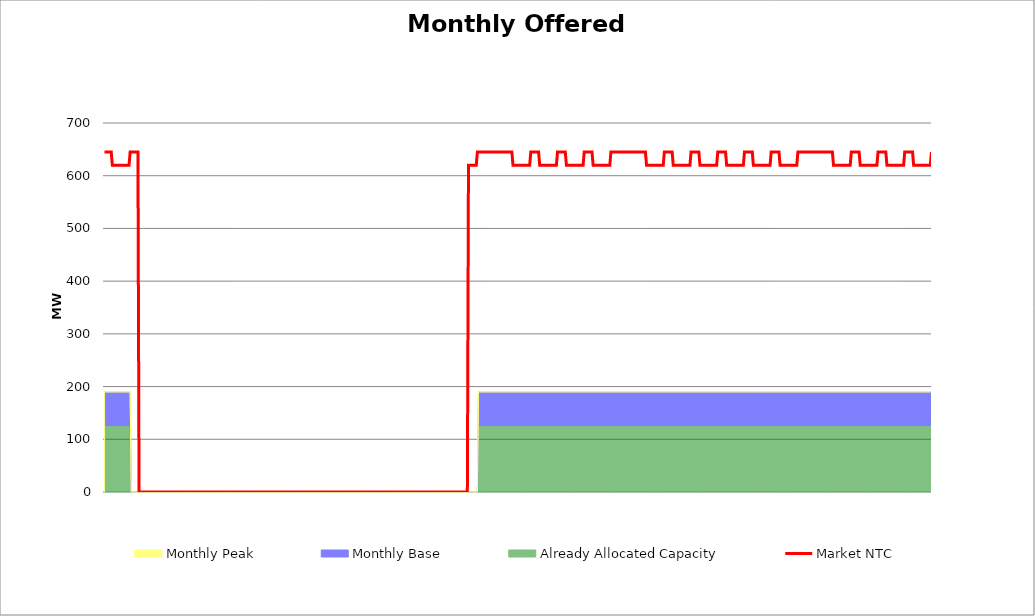
| Category | Market NTC |
|---|---|
| 0 | 645 |
| 1 | 645 |
| 2 | 645 |
| 3 | 645 |
| 4 | 645 |
| 5 | 645 |
| 6 | 645 |
| 7 | 620 |
| 8 | 620 |
| 9 | 620 |
| 10 | 620 |
| 11 | 620 |
| 12 | 620 |
| 13 | 620 |
| 14 | 620 |
| 15 | 620 |
| 16 | 620 |
| 17 | 620 |
| 18 | 620 |
| 19 | 620 |
| 20 | 620 |
| 21 | 620 |
| 22 | 620 |
| 23 | 645 |
| 24 | 645 |
| 25 | 645 |
| 26 | 645 |
| 27 | 645 |
| 28 | 645 |
| 29 | 645 |
| 30 | 645 |
| 31 | 0 |
| 32 | 0 |
| 33 | 0 |
| 34 | 0 |
| 35 | 0 |
| 36 | 0 |
| 37 | 0 |
| 38 | 0 |
| 39 | 0 |
| 40 | 0 |
| 41 | 0 |
| 42 | 0 |
| 43 | 0 |
| 44 | 0 |
| 45 | 0 |
| 46 | 0 |
| 47 | 0 |
| 48 | 0 |
| 49 | 0 |
| 50 | 0 |
| 51 | 0 |
| 52 | 0 |
| 53 | 0 |
| 54 | 0 |
| 55 | 0 |
| 56 | 0 |
| 57 | 0 |
| 58 | 0 |
| 59 | 0 |
| 60 | 0 |
| 61 | 0 |
| 62 | 0 |
| 63 | 0 |
| 64 | 0 |
| 65 | 0 |
| 66 | 0 |
| 67 | 0 |
| 68 | 0 |
| 69 | 0 |
| 70 | 0 |
| 71 | 0 |
| 72 | 0 |
| 73 | 0 |
| 74 | 0 |
| 75 | 0 |
| 76 | 0 |
| 77 | 0 |
| 78 | 0 |
| 79 | 0 |
| 80 | 0 |
| 81 | 0 |
| 82 | 0 |
| 83 | 0 |
| 84 | 0 |
| 85 | 0 |
| 86 | 0 |
| 87 | 0 |
| 88 | 0 |
| 89 | 0 |
| 90 | 0 |
| 91 | 0 |
| 92 | 0 |
| 93 | 0 |
| 94 | 0 |
| 95 | 0 |
| 96 | 0 |
| 97 | 0 |
| 98 | 0 |
| 99 | 0 |
| 100 | 0 |
| 101 | 0 |
| 102 | 0 |
| 103 | 0 |
| 104 | 0 |
| 105 | 0 |
| 106 | 0 |
| 107 | 0 |
| 108 | 0 |
| 109 | 0 |
| 110 | 0 |
| 111 | 0 |
| 112 | 0 |
| 113 | 0 |
| 114 | 0 |
| 115 | 0 |
| 116 | 0 |
| 117 | 0 |
| 118 | 0 |
| 119 | 0 |
| 120 | 0 |
| 121 | 0 |
| 122 | 0 |
| 123 | 0 |
| 124 | 0 |
| 125 | 0 |
| 126 | 0 |
| 127 | 0 |
| 128 | 0 |
| 129 | 0 |
| 130 | 0 |
| 131 | 0 |
| 132 | 0 |
| 133 | 0 |
| 134 | 0 |
| 135 | 0 |
| 136 | 0 |
| 137 | 0 |
| 138 | 0 |
| 139 | 0 |
| 140 | 0 |
| 141 | 0 |
| 142 | 0 |
| 143 | 0 |
| 144 | 0 |
| 145 | 0 |
| 146 | 0 |
| 147 | 0 |
| 148 | 0 |
| 149 | 0 |
| 150 | 0 |
| 151 | 0 |
| 152 | 0 |
| 153 | 0 |
| 154 | 0 |
| 155 | 0 |
| 156 | 0 |
| 157 | 0 |
| 158 | 0 |
| 159 | 0 |
| 160 | 0 |
| 161 | 0 |
| 162 | 0 |
| 163 | 0 |
| 164 | 0 |
| 165 | 0 |
| 166 | 0 |
| 167 | 0 |
| 168 | 0 |
| 169 | 0 |
| 170 | 0 |
| 171 | 0 |
| 172 | 0 |
| 173 | 0 |
| 174 | 0 |
| 175 | 0 |
| 176 | 0 |
| 177 | 0 |
| 178 | 0 |
| 179 | 0 |
| 180 | 0 |
| 181 | 0 |
| 182 | 0 |
| 183 | 0 |
| 184 | 0 |
| 185 | 0 |
| 186 | 0 |
| 187 | 0 |
| 188 | 0 |
| 189 | 0 |
| 190 | 0 |
| 191 | 0 |
| 192 | 0 |
| 193 | 0 |
| 194 | 0 |
| 195 | 0 |
| 196 | 0 |
| 197 | 0 |
| 198 | 0 |
| 199 | 0 |
| 200 | 0 |
| 201 | 0 |
| 202 | 0 |
| 203 | 0 |
| 204 | 0 |
| 205 | 0 |
| 206 | 0 |
| 207 | 0 |
| 208 | 0 |
| 209 | 0 |
| 210 | 0 |
| 211 | 0 |
| 212 | 0 |
| 213 | 0 |
| 214 | 0 |
| 215 | 0 |
| 216 | 0 |
| 217 | 0 |
| 218 | 0 |
| 219 | 0 |
| 220 | 0 |
| 221 | 0 |
| 222 | 0 |
| 223 | 0 |
| 224 | 0 |
| 225 | 0 |
| 226 | 0 |
| 227 | 0 |
| 228 | 0 |
| 229 | 0 |
| 230 | 0 |
| 231 | 0 |
| 232 | 0 |
| 233 | 0 |
| 234 | 0 |
| 235 | 0 |
| 236 | 0 |
| 237 | 0 |
| 238 | 0 |
| 239 | 0 |
| 240 | 0 |
| 241 | 0 |
| 242 | 0 |
| 243 | 0 |
| 244 | 0 |
| 245 | 0 |
| 246 | 0 |
| 247 | 0 |
| 248 | 0 |
| 249 | 0 |
| 250 | 0 |
| 251 | 0 |
| 252 | 0 |
| 253 | 0 |
| 254 | 0 |
| 255 | 0 |
| 256 | 0 |
| 257 | 0 |
| 258 | 0 |
| 259 | 0 |
| 260 | 0 |
| 261 | 0 |
| 262 | 0 |
| 263 | 0 |
| 264 | 0 |
| 265 | 0 |
| 266 | 0 |
| 267 | 0 |
| 268 | 0 |
| 269 | 0 |
| 270 | 0 |
| 271 | 0 |
| 272 | 0 |
| 273 | 0 |
| 274 | 0 |
| 275 | 0 |
| 276 | 0 |
| 277 | 0 |
| 278 | 0 |
| 279 | 0 |
| 280 | 0 |
| 281 | 0 |
| 282 | 0 |
| 283 | 0 |
| 284 | 0 |
| 285 | 0 |
| 286 | 0 |
| 287 | 0 |
| 288 | 0 |
| 289 | 0 |
| 290 | 0 |
| 291 | 0 |
| 292 | 0 |
| 293 | 0 |
| 294 | 0 |
| 295 | 0 |
| 296 | 0 |
| 297 | 0 |
| 298 | 0 |
| 299 | 0 |
| 300 | 0 |
| 301 | 0 |
| 302 | 0 |
| 303 | 0 |
| 304 | 0 |
| 305 | 0 |
| 306 | 0 |
| 307 | 0 |
| 308 | 0 |
| 309 | 0 |
| 310 | 0 |
| 311 | 0 |
| 312 | 0 |
| 313 | 0 |
| 314 | 0 |
| 315 | 0 |
| 316 | 0 |
| 317 | 0 |
| 318 | 0 |
| 319 | 0 |
| 320 | 0 |
| 321 | 0 |
| 322 | 0 |
| 323 | 0 |
| 324 | 0 |
| 325 | 0 |
| 326 | 0 |
| 327 | 620 |
| 328 | 620 |
| 329 | 620 |
| 330 | 620 |
| 331 | 620 |
| 332 | 620 |
| 333 | 620 |
| 334 | 620 |
| 335 | 645 |
| 336 | 645 |
| 337 | 645 |
| 338 | 645 |
| 339 | 645 |
| 340 | 645 |
| 341 | 645 |
| 342 | 645 |
| 343 | 645 |
| 344 | 645 |
| 345 | 645 |
| 346 | 645 |
| 347 | 645 |
| 348 | 645 |
| 349 | 645 |
| 350 | 645 |
| 351 | 645 |
| 352 | 645 |
| 353 | 645 |
| 354 | 645 |
| 355 | 645 |
| 356 | 645 |
| 357 | 645 |
| 358 | 645 |
| 359 | 645 |
| 360 | 645 |
| 361 | 645 |
| 362 | 645 |
| 363 | 645 |
| 364 | 645 |
| 365 | 645 |
| 366 | 645 |
| 367 | 620 |
| 368 | 620 |
| 369 | 620 |
| 370 | 620 |
| 371 | 620 |
| 372 | 620 |
| 373 | 620 |
| 374 | 620 |
| 375 | 620 |
| 376 | 620 |
| 377 | 620 |
| 378 | 620 |
| 379 | 620 |
| 380 | 620 |
| 381 | 620 |
| 382 | 620 |
| 383 | 645 |
| 384 | 645 |
| 385 | 645 |
| 386 | 645 |
| 387 | 645 |
| 388 | 645 |
| 389 | 645 |
| 390 | 645 |
| 391 | 620 |
| 392 | 620 |
| 393 | 620 |
| 394 | 620 |
| 395 | 620 |
| 396 | 620 |
| 397 | 620 |
| 398 | 620 |
| 399 | 620 |
| 400 | 620 |
| 401 | 620 |
| 402 | 620 |
| 403 | 620 |
| 404 | 620 |
| 405 | 620 |
| 406 | 620 |
| 407 | 645 |
| 408 | 645 |
| 409 | 645 |
| 410 | 645 |
| 411 | 645 |
| 412 | 645 |
| 413 | 645 |
| 414 | 645 |
| 415 | 620 |
| 416 | 620 |
| 417 | 620 |
| 418 | 620 |
| 419 | 620 |
| 420 | 620 |
| 421 | 620 |
| 422 | 620 |
| 423 | 620 |
| 424 | 620 |
| 425 | 620 |
| 426 | 620 |
| 427 | 620 |
| 428 | 620 |
| 429 | 620 |
| 430 | 620 |
| 431 | 645 |
| 432 | 645 |
| 433 | 645 |
| 434 | 645 |
| 435 | 645 |
| 436 | 645 |
| 437 | 645 |
| 438 | 645 |
| 439 | 620 |
| 440 | 620 |
| 441 | 620 |
| 442 | 620 |
| 443 | 620 |
| 444 | 620 |
| 445 | 620 |
| 446 | 620 |
| 447 | 620 |
| 448 | 620 |
| 449 | 620 |
| 450 | 620 |
| 451 | 620 |
| 452 | 620 |
| 453 | 620 |
| 454 | 620 |
| 455 | 645 |
| 456 | 645 |
| 457 | 645 |
| 458 | 645 |
| 459 | 645 |
| 460 | 645 |
| 461 | 645 |
| 462 | 645 |
| 463 | 645 |
| 464 | 645 |
| 465 | 645 |
| 466 | 645 |
| 467 | 645 |
| 468 | 645 |
| 469 | 645 |
| 470 | 645 |
| 471 | 645 |
| 472 | 645 |
| 473 | 645 |
| 474 | 645 |
| 475 | 645 |
| 476 | 645 |
| 477 | 645 |
| 478 | 645 |
| 479 | 645 |
| 480 | 645 |
| 481 | 645 |
| 482 | 645 |
| 483 | 645 |
| 484 | 645 |
| 485 | 645 |
| 486 | 645 |
| 487 | 620 |
| 488 | 620 |
| 489 | 620 |
| 490 | 620 |
| 491 | 620 |
| 492 | 620 |
| 493 | 620 |
| 494 | 620 |
| 495 | 620 |
| 496 | 620 |
| 497 | 620 |
| 498 | 620 |
| 499 | 620 |
| 500 | 620 |
| 501 | 620 |
| 502 | 620 |
| 503 | 645 |
| 504 | 645 |
| 505 | 645 |
| 506 | 645 |
| 507 | 645 |
| 508 | 645 |
| 509 | 645 |
| 510 | 645 |
| 511 | 620 |
| 512 | 620 |
| 513 | 620 |
| 514 | 620 |
| 515 | 620 |
| 516 | 620 |
| 517 | 620 |
| 518 | 620 |
| 519 | 620 |
| 520 | 620 |
| 521 | 620 |
| 522 | 620 |
| 523 | 620 |
| 524 | 620 |
| 525 | 620 |
| 526 | 620 |
| 527 | 645 |
| 528 | 645 |
| 529 | 645 |
| 530 | 645 |
| 531 | 645 |
| 532 | 645 |
| 533 | 645 |
| 534 | 645 |
| 535 | 620 |
| 536 | 620 |
| 537 | 620 |
| 538 | 620 |
| 539 | 620 |
| 540 | 620 |
| 541 | 620 |
| 542 | 620 |
| 543 | 620 |
| 544 | 620 |
| 545 | 620 |
| 546 | 620 |
| 547 | 620 |
| 548 | 620 |
| 549 | 620 |
| 550 | 620 |
| 551 | 645 |
| 552 | 645 |
| 553 | 645 |
| 554 | 645 |
| 555 | 645 |
| 556 | 645 |
| 557 | 645 |
| 558 | 645 |
| 559 | 620 |
| 560 | 620 |
| 561 | 620 |
| 562 | 620 |
| 563 | 620 |
| 564 | 620 |
| 565 | 620 |
| 566 | 620 |
| 567 | 620 |
| 568 | 620 |
| 569 | 620 |
| 570 | 620 |
| 571 | 620 |
| 572 | 620 |
| 573 | 620 |
| 574 | 620 |
| 575 | 645 |
| 576 | 645 |
| 577 | 645 |
| 578 | 645 |
| 579 | 645 |
| 580 | 645 |
| 581 | 645 |
| 582 | 645 |
| 583 | 620 |
| 584 | 620 |
| 585 | 620 |
| 586 | 620 |
| 587 | 620 |
| 588 | 620 |
| 589 | 620 |
| 590 | 620 |
| 591 | 620 |
| 592 | 620 |
| 593 | 620 |
| 594 | 620 |
| 595 | 620 |
| 596 | 620 |
| 597 | 620 |
| 598 | 620 |
| 599 | 645 |
| 600 | 645 |
| 601 | 645 |
| 602 | 645 |
| 603 | 645 |
| 604 | 645 |
| 605 | 645 |
| 606 | 645 |
| 607 | 620 |
| 608 | 620 |
| 609 | 620 |
| 610 | 620 |
| 611 | 620 |
| 612 | 620 |
| 613 | 620 |
| 614 | 620 |
| 615 | 620 |
| 616 | 620 |
| 617 | 620 |
| 618 | 620 |
| 619 | 620 |
| 620 | 620 |
| 621 | 620 |
| 622 | 620 |
| 623 | 645 |
| 624 | 645 |
| 625 | 645 |
| 626 | 645 |
| 627 | 645 |
| 628 | 645 |
| 629 | 645 |
| 630 | 645 |
| 631 | 645 |
| 632 | 645 |
| 633 | 645 |
| 634 | 645 |
| 635 | 645 |
| 636 | 645 |
| 637 | 645 |
| 638 | 645 |
| 639 | 645 |
| 640 | 645 |
| 641 | 645 |
| 642 | 645 |
| 643 | 645 |
| 644 | 645 |
| 645 | 645 |
| 646 | 645 |
| 647 | 645 |
| 648 | 645 |
| 649 | 645 |
| 650 | 645 |
| 651 | 645 |
| 652 | 645 |
| 653 | 645 |
| 654 | 645 |
| 655 | 620 |
| 656 | 620 |
| 657 | 620 |
| 658 | 620 |
| 659 | 620 |
| 660 | 620 |
| 661 | 620 |
| 662 | 620 |
| 663 | 620 |
| 664 | 620 |
| 665 | 620 |
| 666 | 620 |
| 667 | 620 |
| 668 | 620 |
| 669 | 620 |
| 670 | 620 |
| 671 | 645 |
| 672 | 645 |
| 673 | 645 |
| 674 | 645 |
| 675 | 645 |
| 676 | 645 |
| 677 | 645 |
| 678 | 645 |
| 679 | 620 |
| 680 | 620 |
| 681 | 620 |
| 682 | 620 |
| 683 | 620 |
| 684 | 620 |
| 685 | 620 |
| 686 | 620 |
| 687 | 620 |
| 688 | 620 |
| 689 | 620 |
| 690 | 620 |
| 691 | 620 |
| 692 | 620 |
| 693 | 620 |
| 694 | 620 |
| 695 | 645 |
| 696 | 645 |
| 697 | 645 |
| 698 | 645 |
| 699 | 645 |
| 700 | 645 |
| 701 | 645 |
| 702 | 645 |
| 703 | 620 |
| 704 | 620 |
| 705 | 620 |
| 706 | 620 |
| 707 | 620 |
| 708 | 620 |
| 709 | 620 |
| 710 | 620 |
| 711 | 620 |
| 712 | 620 |
| 713 | 620 |
| 714 | 620 |
| 715 | 620 |
| 716 | 620 |
| 717 | 620 |
| 718 | 620 |
| 719 | 645 |
| 720 | 645 |
| 721 | 645 |
| 722 | 645 |
| 723 | 645 |
| 724 | 645 |
| 725 | 645 |
| 726 | 645 |
| 727 | 620 |
| 728 | 620 |
| 729 | 620 |
| 730 | 620 |
| 731 | 620 |
| 732 | 620 |
| 733 | 620 |
| 734 | 620 |
| 735 | 620 |
| 736 | 620 |
| 737 | 620 |
| 738 | 620 |
| 739 | 620 |
| 740 | 620 |
| 741 | 620 |
| 742 | 620 |
| 743 | 645 |